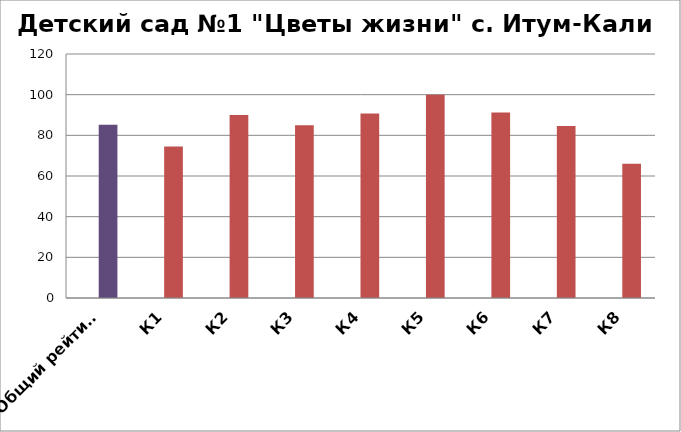
| Category | Series 0 | Детский сад №1 «Цветы жизни» с. Итум-Кали  |
|---|---|---|
| Общий рейтинг |  | 85.222 |
| К1 |  | 74.5 |
| К2 |  | 90 |
| К3 |  | 85 |
| К4 |  | 90.75 |
| К5 |  | 100 |
| К6 |  | 91.25 |
| К7 |  | 84.6 |
| К8 |  | 66 |